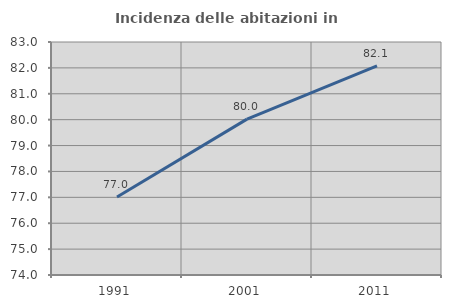
| Category | Incidenza delle abitazioni in proprietà  |
|---|---|
| 1991.0 | 77.015 |
| 2001.0 | 80.021 |
| 2011.0 | 82.074 |